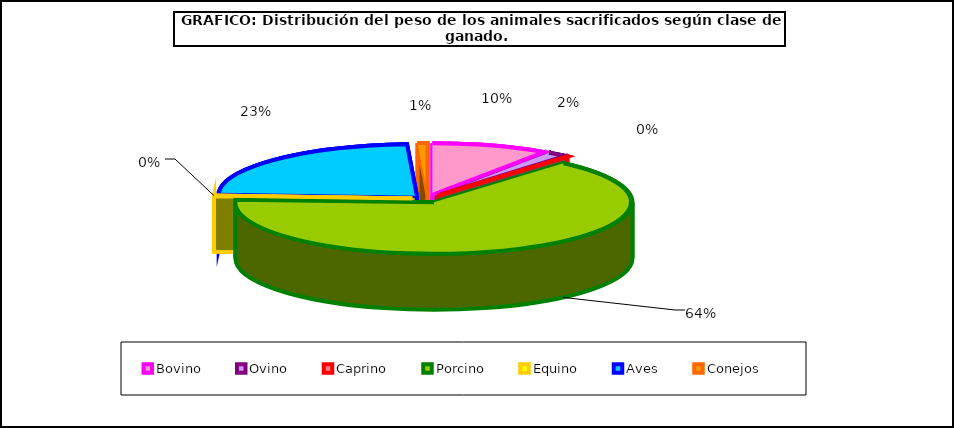
| Category | Series 0 |
|---|---|
| 0 | 669008.285 |
| 1 | 115113.778 |
| 2 | 10713.407 |
| 3 | 4530474.049 |
| 4 | 10193.934 |
| 5 | 1636818.541 |
| 6 | 55823.653 |